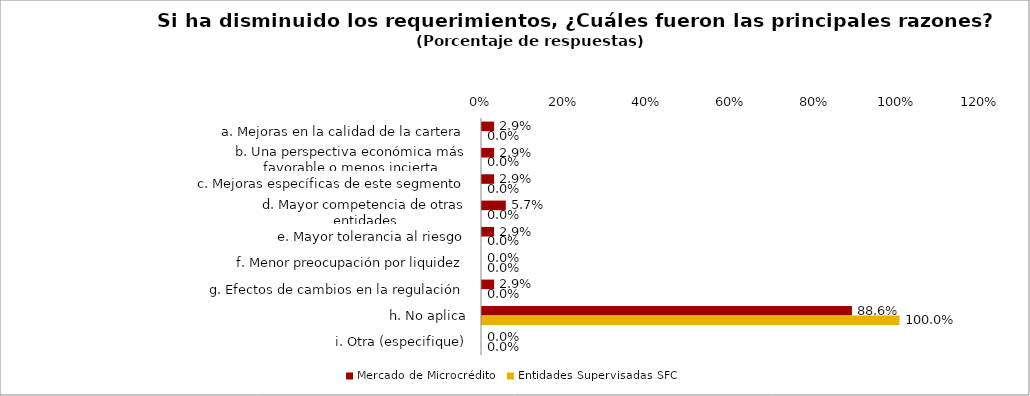
| Category | Mercado de Microcrédito | Entidades Supervisadas SFC |
|---|---|---|
| a. Mejoras en la calidad de la cartera | 0.029 | 0 |
| b. Una perspectiva económica más favorable o menos incierta | 0.029 | 0 |
| c. Mejoras específicas de este segmento | 0.029 | 0 |
| d. Mayor competencia de otras entidades | 0.057 | 0 |
| e. Mayor tolerancia al riesgo | 0.029 | 0 |
| f. Menor preocupación por liquidez | 0 | 0 |
| g. Efectos de cambios en la regulación | 0.029 | 0 |
| h. No aplica | 0.886 | 1 |
| i. Otra (especifique) | 0 | 0 |